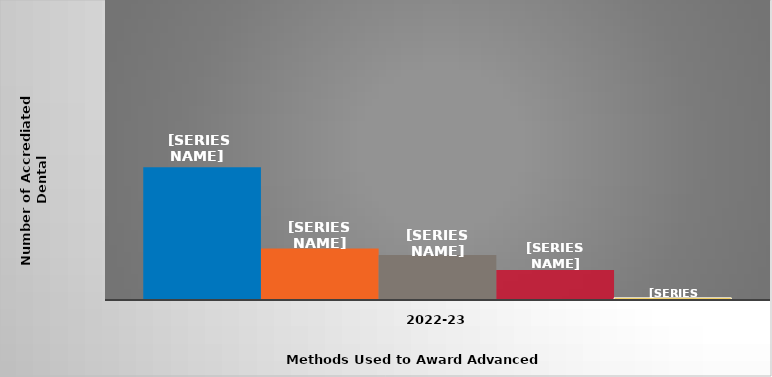
| Category | Transfer of credit | Equivalency examinations | Challenge examinations | Other | Completion of non-accredited dental assisting program at institution |
|---|---|---|---|---|---|
| 2022-23 | 62 | 24 | 21 | 14 | 1 |